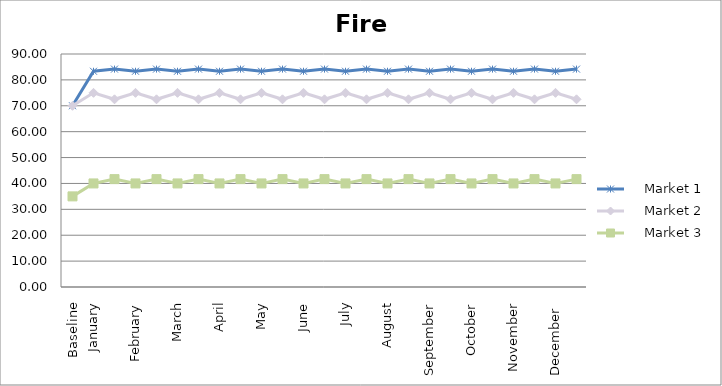
| Category |     Market 1 |     Market 2 |     Market 3 |
|---|---|---|---|
| Baseline | 70 | 70 | 35 |
| January | 83.333 | 75 | 40 |
|  | 84.167 | 72.5 | 41.667 |
| February | 83.333 | 75 | 40 |
|  | 84.167 | 72.5 | 41.667 |
| March | 83.333 | 75 | 40 |
|  | 84.167 | 72.5 | 41.667 |
| April | 83.333 | 75 | 40 |
|  | 84.167 | 72.5 | 41.667 |
| May | 83.333 | 75 | 40 |
|  | 84.167 | 72.5 | 41.667 |
| June | 83.333 | 75 | 40 |
|  | 84.167 | 72.5 | 41.667 |
| July | 83.333 | 75 | 40 |
|  | 84.167 | 72.5 | 41.667 |
| August | 83.333 | 75 | 40 |
|  | 84.167 | 72.5 | 41.667 |
| September | 83.333 | 75 | 40 |
|  | 84.167 | 72.5 | 41.667 |
| October | 83.333 | 75 | 40 |
|  | 84.167 | 72.5 | 41.667 |
| November | 83.333 | 75 | 40 |
|  | 84.167 | 72.5 | 41.667 |
| December  | 83.333 | 75 | 40 |